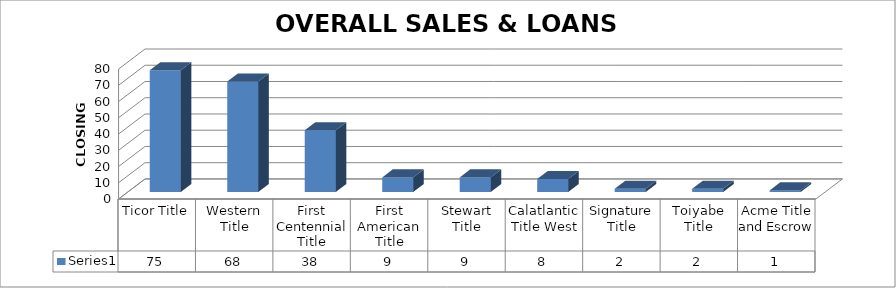
| Category | Series 0 |
|---|---|
| Ticor Title | 75 |
| Western Title | 68 |
| First Centennial Title | 38 |
| First American Title | 9 |
| Stewart Title | 9 |
| Calatlantic Title West | 8 |
| Signature Title | 2 |
| Toiyabe Title | 2 |
| Acme Title and Escrow | 1 |